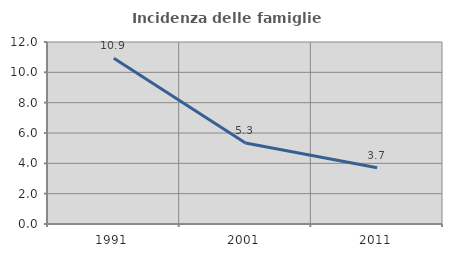
| Category | Incidenza delle famiglie numerose |
|---|---|
| 1991.0 | 10.93 |
| 2001.0 | 5.338 |
| 2011.0 | 3.715 |